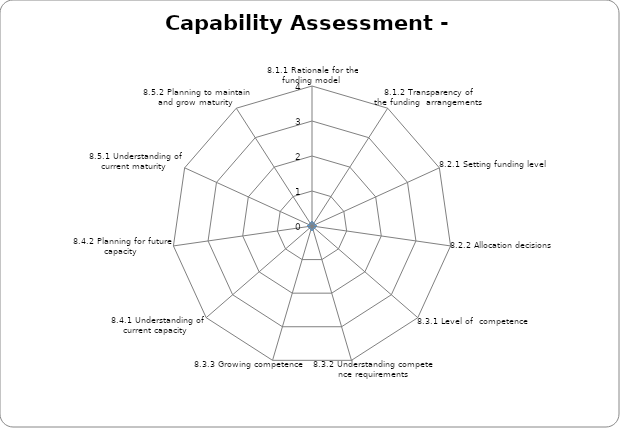
| Category | Series 0 |
|---|---|
| 8.1.1 Rationale for the funding model  | 0 |
| 8.1.2 Transparency of the funding  arrangements | 0 |
| 8.2.1 Setting funding level | 0 |
| 8.2.2 Allocation decisions  | 0 |
| 8.3.1 Level of  competence  | 0 |
| 8.3.2 Understanding competence requirements | 0 |
| 8.3.3 Growing competence  | 0 |
| 8.4.1 Understanding of current capacity  | 0 |
| 8.4.2 Planning for future capacity  | 0 |
| 8.5.1 Understanding of current maturity  | 0 |
| 8.5.2 Planning to maintain and grow maturity  | 0 |